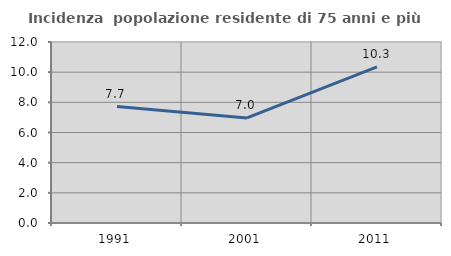
| Category | Incidenza  popolazione residente di 75 anni e più |
|---|---|
| 1991.0 | 7.716 |
| 2001.0 | 6.969 |
| 2011.0 | 10.345 |